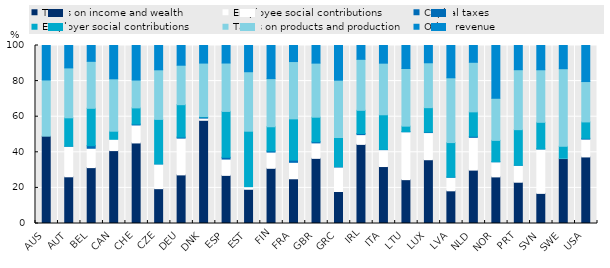
| Category | Taxes on income and wealth | Employee social contributions | Capital taxes | Employer social contributions | Taxes on products and production | Other revenue |
|---|---|---|---|---|---|---|
| AUS | 49.06 | 0 | 0 | 0 | 31.589 | 19.351 |
| AUT | 26.241 | 17.196 | 0.008 | 15.934 | 28.039 | 12.582 |
| BEL | 31.392 | 10.875 | 1.432 | 21.013 | 26.397 | 8.891 |
| CAN | 40.95 | 6.353 | 0 | 4.551 | 29.427 | 18.719 |
| CHE | 45.253 | 10.089 | 0.501 | 9.1 | 15.655 | 19.402 |
| CZE | 19.569 | 13.915 | 0.001 | 25.004 | 27.854 | 13.657 |
| DEU | 27.311 | 20.649 | 0.554 | 18.243 | 22.169 | 11.073 |
| DNK | 57.984 | 1.215 | 0.539 | 0.346 | 30.044 | 9.872 |
| ESP | 27.036 | 9.16 | 0.989 | 25.783 | 27.187 | 9.844 |
| EST | 19.233 | 1.458 | 0 | 31.16 | 33.41 | 14.739 |
| FIN | 31.005 | 9.104 | 0.655 | 13.589 | 27.03 | 18.617 |
| FRA | 25.126 | 9.241 | 1.241 | 23.184 | 32.186 | 9.021 |
| GBR | 36.597 | 8.695 | 0.633 | 13.8 | 30.376 | 9.899 |
| GRC | 17.974 | 13.756 | 0.225 | 16.36 | 32.208 | 19.476 |
| IRL | 44.444 | 5.488 | 0.597 | 13.055 | 28.649 | 7.766 |
| ITA | 31.996 | 9.485 | 0.121 | 19.481 | 28.997 | 9.92 |
| LTU | 24.631 | 26.936 | 0.011 | 3.115 | 32.391 | 12.916 |
| LUX | 35.824 | 15.265 | 0.301 | 13.685 | 25.219 | 9.705 |
| LVA | 18.367 | 7.625 | 0.103 | 19.364 | 36.401 | 18.139 |
| NLD | 29.994 | 18.409 | 0.593 | 13.728 | 27.845 | 9.431 |
| NOR | 26.184 | 8.515 | 0.003 | 11.992 | 23.664 | 29.641 |
| PRT | 23.192 | 9.55 | 0 | 19.977 | 33.674 | 13.607 |
| SVN | 16.924 | 24.946 | 0.06 | 14.924 | 29.512 | 13.634 |
| SWE | 36.492 | 0.123 | 0 | 6.771 | 43.578 | 13.036 |
| USA | 37.397 | 10.002 | 0.443 | 9.225 | 22.677 | 20.255 |